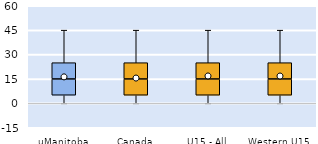
| Category | 25th | 50th | 75th |
|---|---|---|---|
| uManitoba | 5 | 10 | 10 |
| Canada | 5 | 10 | 10 |
| U15 - All | 5 | 10 | 10 |
| Western U15 | 5 | 10 | 10 |